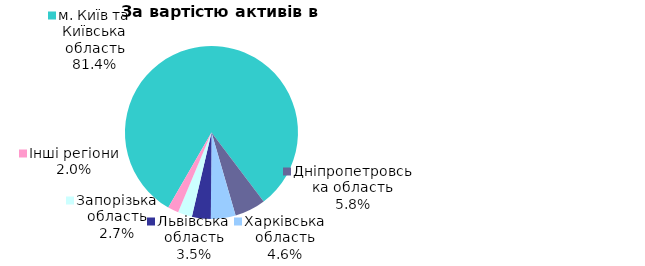
| Category | Series 0 |
|---|---|
| м. Київ та Київська область | 0.814 |
| Дніпропетровська область | 0.058 |
| Харківська область | 0.046 |
| Львівська область | 0.035 |
| Запорізька область | 0.027 |
| Інші регіони | 0.02 |